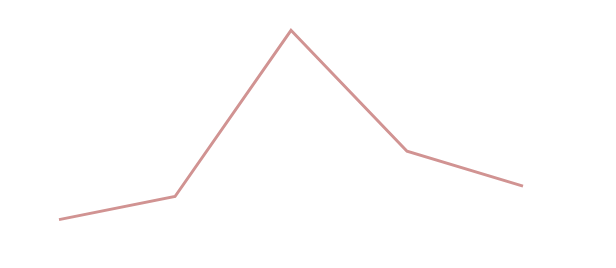
| Category | Excel School - Dashboards Membership | PM Templates for Excel [2007] | Excel School - Download Membership | Dashboard Tutorial #1 | PM Templates for Excel [both] | PM Templates for Excel [2003] | Excel School - Online Membership | Excel Formula e-book |
|---|---|---|---|---|---|---|---|---|
| Jan |  |  |  |  |  |  |  | 0.005 |
| Feb |  |  |  |  |  |  |  | 0.009 |
| Mar |  |  |  |  |  |  |  | 0.037 |
| Apr |  |  |  |  |  |  |  | 0.017 |
| May |  |  |  |  |  |  |  | 0.011 |